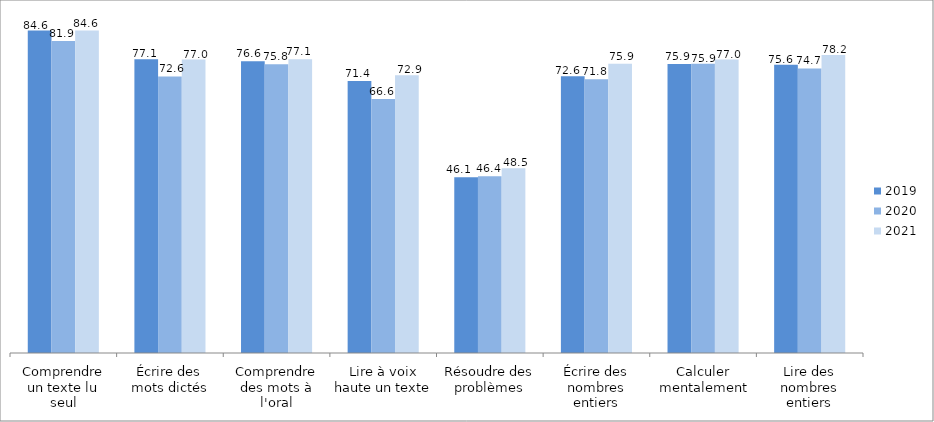
| Category | 2019 | 2020 | 2021 |
|---|---|---|---|
| Comprendre un texte lu seul | 84.61 | 81.85 | 84.6 |
| Écrire des mots dictés | 77.11 | 72.58 | 77 |
| Comprendre des mots à l'oral | 76.58 | 75.78 | 77.1 |
| Lire à voix haute un texte | 71.4 | 66.64 | 72.9 |
| Résoudre des problèmes | 46.1 | 46.4 | 48.5 |
| Écrire des nombres entiers | 72.6 | 71.83 | 75.9 |
| Calculer mentalement | 75.86 | 75.88 | 77 |
| Lire des nombres entiers | 75.62 | 74.66 | 78.2 |